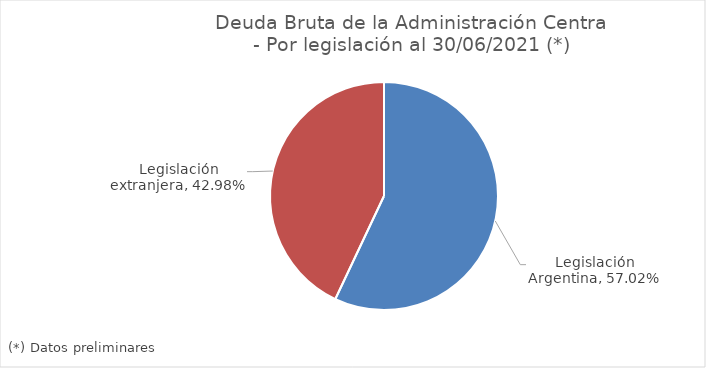
| Category | Series 0 |
|---|---|
| Legislación Argentina | 0.57 |
| Legislación extranjera | 0.43 |